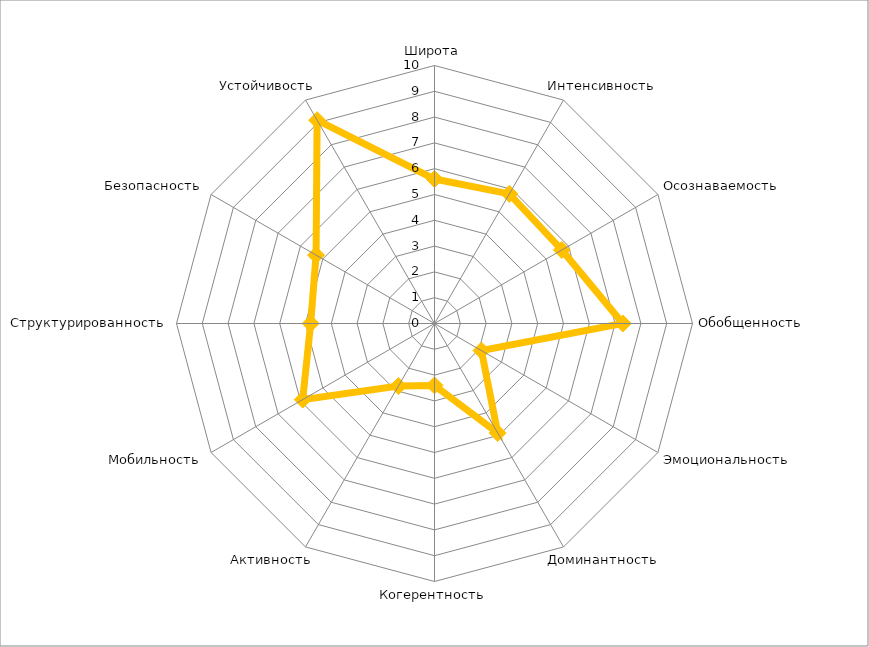
| Category | Series 0 |
|---|---|
| Широта | 5.6 |
| Интенсивность | 5.8 |
| Осознаваемость | 5.7 |
| Обобщенность | 7.3 |
| Эмоциональность | 2.1 |
| Доминантность | 4.9 |
| Когерентность | 2.4 |
| Активность | 2.8 |
| Мобильность | 5.9 |
| Структурированность | 4.8 |
| Безопасность | 5.3 |
| Устойчивость | 9.1 |